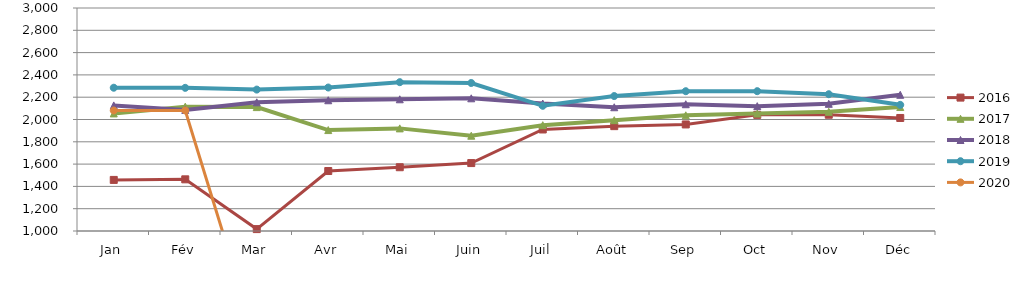
| Category | 2015 | 2016 | 2017 | 2018 | 2019 | 2020 |
|---|---|---|---|---|---|---|
| Jan |  | 1458.214 | 2054.395 | 2126.277 | 2284.924 | 2081.022 |
| Fév |  | 1463.416 | 2115.311 | 2085.963 | 2283.888 | 2081.025 |
| Mar |  | 1017.047 | 2111.189 | 2154.037 | 2268.248 | 0 |
| Avr |  | 1537.919 | 1905.198 | 2172.539 | 2286.798 | 0 |
| Mai |  | 1572.029 | 1920.326 | 2181.273 | 2334.716 | 0 |
| Juin |  | 1609.202 | 1854.56 | 2190.063 | 2327.34 | 0 |
| Juil |  | 1910.587 | 1949.051 | 2142.687 | 2122.888 | 0 |
| Août |  | 1940.425 | 1993.838 | 2109.923 | 2210.241 | 0 |
| Sep |  | 1955.625 | 2037.657 | 2136.919 | 2253.763 | 0 |
| Oct |  | 2041.514 | 2053.428 | 2119.72 | 2254.039 | 0 |
| Nov |  | 2042.546 | 2069.192 | 2140.719 | 2226.726 | 0 |
| Déc |  | 2013.599 | 2111.843 | 2221.415 | 2131.427 | 0 |